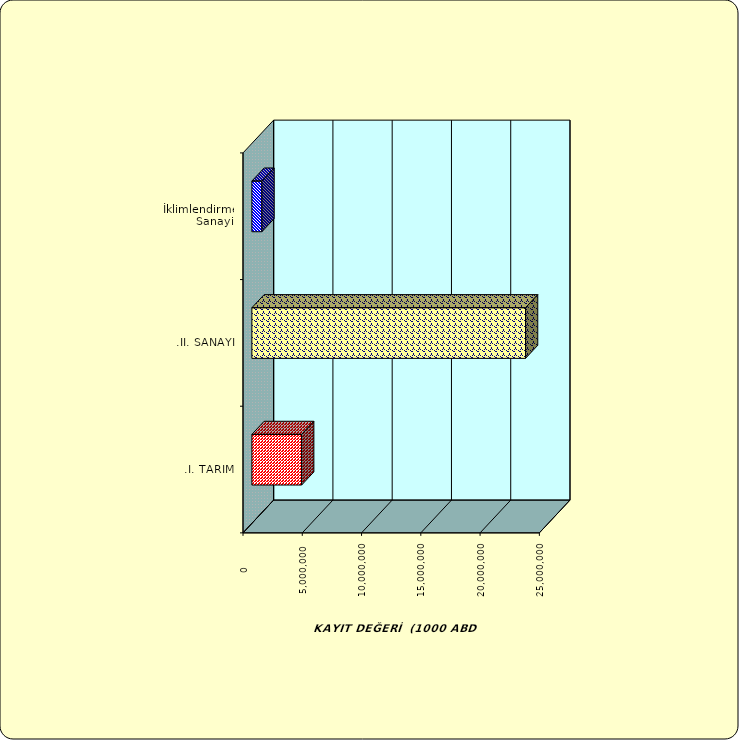
| Category | Series 0 |
|---|---|
| .I. TARIM | 4197738.958 |
| .II. SANAYİ | 23083825.249 |
|  İklimlendirme Sanayii | 846821.915 |